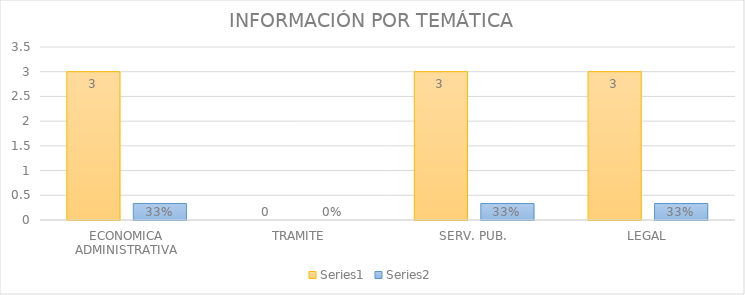
| Category | Series 3 | Series 4 |
|---|---|---|
| ECONOMICA ADMINISTRATIVA | 3 | 0.333 |
| TRAMITE | 0 | 0 |
| SERV. PUB. | 3 | 0.333 |
| LEGAL | 3 | 0.333 |